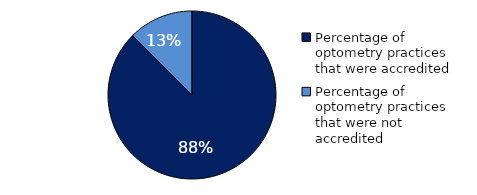
| Category | Series 0 |
|---|---|
| Percentage of optometry practices that were accredited | 0.875 |
| Percentage of optometry practices that were not accredited | 0.125 |